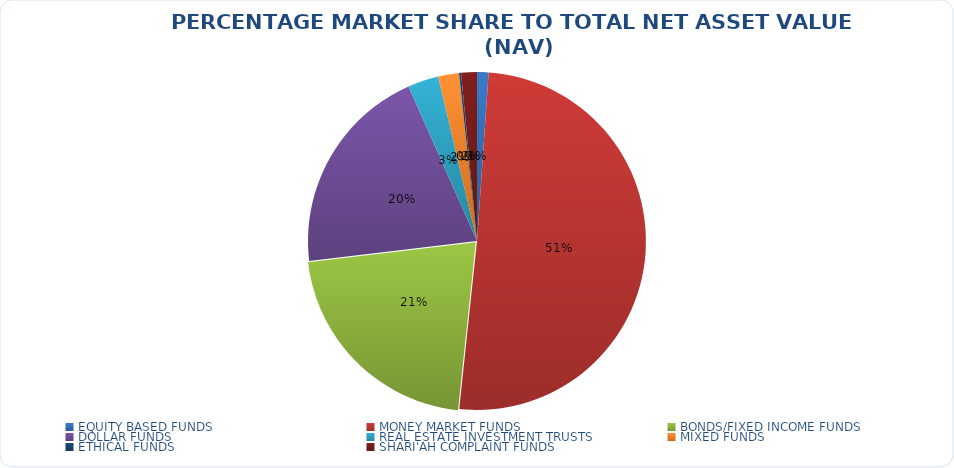
| Category | NET ASSET VALUE |
|---|---|
| EQUITY BASED FUNDS | 17291112299.79 |
| MONEY MARKET FUNDS | 796016399970.13 |
| BONDS/FIXED INCOME FUNDS | 337420772556.374 |
| DOLLAR FUNDS | 318565990487.86 |
| REAL ESTATE INVESTMENT TRUSTS | 46384295590.5 |
| MIXED FUNDS | 31275370993.764 |
| ETHICAL FUNDS | 3177550412.06 |
| SHARI'AH COMPLAINT FUNDS | 23646207806.78 |